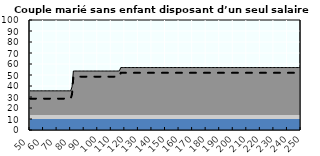
| Category | Coin fiscal marginal (somme des composantes) | Taux d’imposition marginal net |
|---|---|---|
| 50.0 | 35.615 | 28.5 |
| 51.0 | 35.615 | 28.5 |
| 52.0 | 35.615 | 28.5 |
| 53.0 | 35.615 | 28.5 |
| 54.0 | 35.615 | 28.5 |
| 55.0 | 35.615 | 28.5 |
| 56.0 | 35.615 | 28.5 |
| 57.0 | 35.615 | 28.5 |
| 58.0 | 35.615 | 28.5 |
| 59.0 | 35.615 | 28.5 |
| 60.0 | 35.615 | 28.5 |
| 61.0 | 35.615 | 28.5 |
| 62.0 | 35.615 | 28.5 |
| 63.0 | 35.615 | 28.5 |
| 64.0 | 35.615 | 28.5 |
| 65.0 | 35.615 | 28.5 |
| 66.0 | 35.615 | 28.5 |
| 67.0 | 35.615 | 28.5 |
| 68.0 | 35.615 | 28.5 |
| 69.0 | 35.615 | 28.5 |
| 70.0 | 35.615 | 28.5 |
| 71.0 | 35.615 | 28.5 |
| 72.0 | 35.615 | 28.5 |
| 73.0 | 35.615 | 28.5 |
| 74.0 | 35.615 | 28.5 |
| 75.0 | 35.615 | 28.5 |
| 76.0 | 35.615 | 28.5 |
| 77.0 | 35.615 | 28.5 |
| 78.0 | 35.615 | 28.5 |
| 79.0 | 35.615 | 28.5 |
| 80.0 | 35.615 | 28.5 |
| 81.0 | 39.144 | 32.42 |
| 82.0 | 53.624 | 48.5 |
| 83.0 | 53.624 | 48.5 |
| 84.0 | 53.624 | 48.5 |
| 85.0 | 53.624 | 48.5 |
| 86.0 | 53.624 | 48.5 |
| 87.0 | 53.624 | 48.5 |
| 88.0 | 53.624 | 48.5 |
| 89.0 | 53.624 | 48.5 |
| 90.0 | 53.624 | 48.5 |
| 91.0 | 53.624 | 48.5 |
| 92.0 | 53.624 | 48.5 |
| 93.0 | 53.624 | 48.5 |
| 94.0 | 53.624 | 48.5 |
| 95.0 | 53.624 | 48.5 |
| 96.0 | 53.624 | 48.5 |
| 97.0 | 53.624 | 48.5 |
| 98.0 | 53.624 | 48.5 |
| 99.0 | 53.624 | 48.5 |
| 100.0 | 53.624 | 48.5 |
| 101.0 | 53.624 | 48.5 |
| 102.0 | 53.624 | 48.5 |
| 103.0 | 53.624 | 48.5 |
| 104.0 | 53.624 | 48.5 |
| 105.0 | 53.624 | 48.5 |
| 106.0 | 53.624 | 48.5 |
| 107.0 | 53.624 | 48.5 |
| 108.0 | 53.624 | 48.5 |
| 109.0 | 53.624 | 48.5 |
| 110.0 | 53.624 | 48.5 |
| 111.0 | 53.624 | 48.5 |
| 112.0 | 53.624 | 48.5 |
| 113.0 | 53.624 | 48.5 |
| 114.0 | 53.624 | 48.5 |
| 115.0 | 53.624 | 48.5 |
| 116.0 | 53.825 | 48.723 |
| 117.0 | 56.776 | 52 |
| 118.0 | 56.776 | 52 |
| 119.0 | 56.776 | 52 |
| 120.0 | 56.776 | 52 |
| 121.0 | 56.776 | 52 |
| 122.0 | 56.776 | 52 |
| 123.0 | 56.776 | 52 |
| 124.0 | 56.776 | 52 |
| 125.0 | 56.776 | 52 |
| 126.0 | 56.776 | 52 |
| 127.0 | 56.776 | 52 |
| 128.0 | 56.776 | 52 |
| 129.0 | 56.776 | 52 |
| 130.0 | 56.776 | 52 |
| 131.0 | 56.776 | 52 |
| 132.0 | 56.776 | 52 |
| 133.0 | 56.776 | 52 |
| 134.0 | 56.776 | 52 |
| 135.0 | 56.776 | 52 |
| 136.0 | 56.776 | 52 |
| 137.0 | 56.776 | 52 |
| 138.0 | 56.776 | 52 |
| 139.0 | 56.776 | 52 |
| 140.0 | 56.776 | 52 |
| 141.0 | 56.776 | 52 |
| 142.0 | 56.776 | 52 |
| 143.0 | 56.776 | 52 |
| 144.0 | 56.776 | 52 |
| 145.0 | 56.776 | 52 |
| 146.0 | 56.776 | 52 |
| 147.0 | 56.776 | 52 |
| 148.0 | 56.776 | 52 |
| 149.0 | 56.776 | 52 |
| 150.0 | 56.776 | 52 |
| 151.0 | 56.776 | 52 |
| 152.0 | 56.776 | 52 |
| 153.0 | 56.776 | 52 |
| 154.0 | 56.776 | 52 |
| 155.0 | 56.776 | 52 |
| 156.0 | 56.776 | 52 |
| 157.0 | 56.776 | 52 |
| 158.0 | 56.776 | 52 |
| 159.0 | 56.776 | 52 |
| 160.0 | 56.776 | 52 |
| 161.0 | 56.776 | 52 |
| 162.0 | 56.776 | 52 |
| 163.0 | 56.776 | 52 |
| 164.0 | 56.776 | 52 |
| 165.0 | 56.776 | 52 |
| 166.0 | 56.776 | 52 |
| 167.0 | 56.776 | 52 |
| 168.0 | 56.776 | 52 |
| 169.0 | 56.776 | 52 |
| 170.0 | 56.776 | 52 |
| 171.0 | 56.776 | 52 |
| 172.0 | 56.776 | 52 |
| 173.0 | 56.776 | 52 |
| 174.0 | 56.776 | 52 |
| 175.0 | 56.776 | 52 |
| 176.0 | 56.776 | 52 |
| 177.0 | 56.776 | 52 |
| 178.0 | 56.776 | 52 |
| 179.0 | 56.776 | 52 |
| 180.0 | 56.776 | 52 |
| 181.0 | 56.776 | 52 |
| 182.0 | 56.776 | 52 |
| 183.0 | 56.776 | 52 |
| 184.0 | 56.776 | 52 |
| 185.0 | 56.776 | 52 |
| 186.0 | 56.776 | 52 |
| 187.0 | 56.776 | 52 |
| 188.0 | 56.776 | 52 |
| 189.0 | 56.776 | 52 |
| 190.0 | 56.776 | 52 |
| 191.0 | 56.776 | 52 |
| 192.0 | 56.776 | 52 |
| 193.0 | 56.776 | 52 |
| 194.0 | 56.776 | 52 |
| 195.0 | 56.776 | 52 |
| 196.0 | 56.776 | 52 |
| 197.0 | 56.776 | 52 |
| 198.0 | 56.776 | 52 |
| 199.0 | 56.776 | 52 |
| 200.0 | 56.776 | 52 |
| 201.0 | 56.776 | 52 |
| 202.0 | 56.776 | 52 |
| 203.0 | 56.776 | 52 |
| 204.0 | 56.776 | 52 |
| 205.0 | 56.776 | 52 |
| 206.0 | 56.776 | 52 |
| 207.0 | 56.776 | 52 |
| 208.0 | 56.776 | 52 |
| 209.0 | 56.776 | 52 |
| 210.0 | 56.776 | 52 |
| 211.0 | 56.776 | 52 |
| 212.0 | 56.776 | 52 |
| 213.0 | 56.776 | 52 |
| 214.0 | 56.776 | 52 |
| 215.0 | 56.776 | 52 |
| 216.0 | 56.776 | 52 |
| 217.0 | 56.776 | 52 |
| 218.0 | 56.776 | 52 |
| 219.0 | 56.776 | 52 |
| 220.0 | 56.776 | 52 |
| 221.0 | 56.776 | 52 |
| 222.0 | 56.776 | 52 |
| 223.0 | 56.776 | 52 |
| 224.0 | 56.776 | 52 |
| 225.0 | 56.776 | 52 |
| 226.0 | 56.776 | 52 |
| 227.0 | 56.776 | 52 |
| 228.0 | 56.776 | 52 |
| 229.0 | 56.776 | 52 |
| 230.0 | 56.776 | 52 |
| 231.0 | 56.776 | 52 |
| 232.0 | 56.776 | 52 |
| 233.0 | 56.776 | 52 |
| 234.0 | 56.776 | 52 |
| 235.0 | 56.776 | 52 |
| 236.0 | 56.776 | 52 |
| 237.0 | 56.776 | 52 |
| 238.0 | 56.776 | 52 |
| 239.0 | 56.776 | 52 |
| 240.0 | 56.776 | 52 |
| 241.0 | 56.776 | 52 |
| 242.0 | 56.776 | 52 |
| 243.0 | 56.776 | 52 |
| 244.0 | 56.776 | 52 |
| 245.0 | 56.776 | 52 |
| 246.0 | 56.776 | 52 |
| 247.0 | 56.776 | 52 |
| 248.0 | 56.776 | 52 |
| 249.0 | 56.776 | 52 |
| 250.0 | 56.776 | 52 |